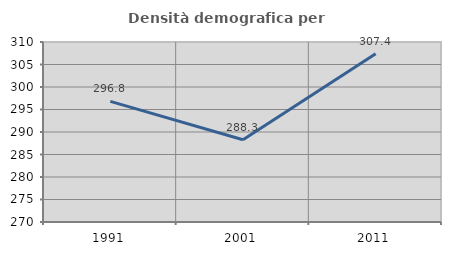
| Category | Densità demografica |
|---|---|
| 1991.0 | 296.813 |
| 2001.0 | 288.284 |
| 2011.0 | 307.401 |